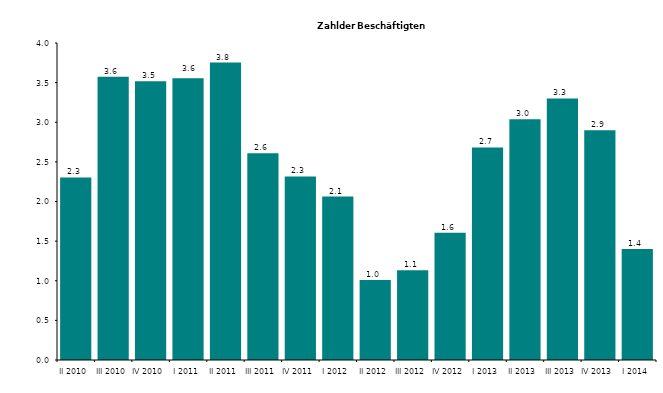
| Category | Series 0 |
|---|---|
| II 2010 | 2.304 |
| III 2010 | 3.573 |
| IV 2010 | 3.516 |
| I 2011 | 3.556 |
| II 2011 | 3.754 |
| III 2011 | 2.61 |
| IV 2011 | 2.316 |
| I 2012 | 2.063 |
| II 2012 | 1.009 |
| III 2012 | 1.132 |
| IV 2012 | 1.607 |
| I 2013 | 2.682 |
| II 2013 | 3.039 |
| III 2013 | 3.3 |
| IV 2013 | 2.9 |
| I 2014 | 1.4 |